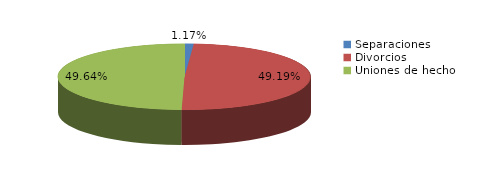
| Category | Series 0 |
|---|---|
| Separaciones | 36 |
| Divorcios | 1520 |
| Uniones de hecho | 1534 |